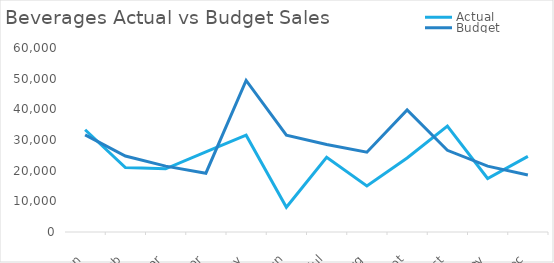
| Category | Actual | Budget |
|---|---|---|
| 2014-01-01 | 33333.54 | 31671 |
| 2014-02-01 | 20995.77 | 24785 |
| 2014-03-01 | 20603.49 | 21477 |
| 2014-04-01 | 26114.29 | 19171 |
| 2014-05-01 | 31579.16 | 49416 |
| 2014-06-01 | 8071.38 | 31562 |
| 2014-07-01 | 24382.35 | 28522 |
| 2014-08-01 | 15011.9 | 26019 |
| 2014-09-01 | 24151.59 | 39820 |
| 2014-10-01 | 34526.82 | 26641 |
| 2014-11-01 | 17449.14 | 21470 |
| 2014-12-01 | 24652.72 | 18606 |